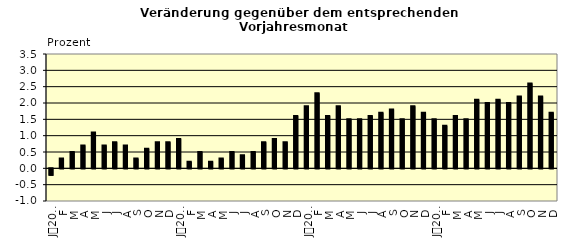
| Category | Series 0 |
|---|---|
| 0 | -0.2 |
| 1 | 0.3 |
| 2 | 0.5 |
| 3 | 0.7 |
| 4 | 1.1 |
| 5 | 0.7 |
| 6 | 0.8 |
| 7 | 0.7 |
| 8 | 0.3 |
| 9 | 0.6 |
| 10 | 0.8 |
| 11 | 0.8 |
| 12 | 0.9 |
| 13 | 0.2 |
| 14 | 0.5 |
| 15 | 0.2 |
| 16 | 0.3 |
| 17 | 0.5 |
| 18 | 0.4 |
| 19 | 0.5 |
| 20 | 0.8 |
| 21 | 0.9 |
| 22 | 0.8 |
| 23 | 1.6 |
| 24 | 1.9 |
| 25 | 2.3 |
| 26 | 1.6 |
| 27 | 1.9 |
| 28 | 1.5 |
| 29 | 1.5 |
| 30 | 1.6 |
| 31 | 1.7 |
| 32 | 1.8 |
| 33 | 1.5 |
| 34 | 1.9 |
| 35 | 1.7 |
| 36 | 1.5 |
| 37 | 1.3 |
| 38 | 1.6 |
| 39 | 1.5 |
| 40 | 2.1 |
| 41 | 2 |
| 42 | 2.1 |
| 43 | 2 |
| 44 | 2.2 |
| 45 | 2.6 |
| 46 | 2.2 |
| 47 | 1.7 |